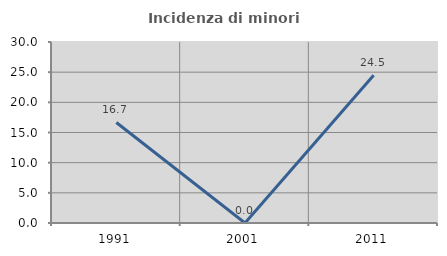
| Category | Incidenza di minori stranieri |
|---|---|
| 1991.0 | 16.667 |
| 2001.0 | 0 |
| 2011.0 | 24.49 |